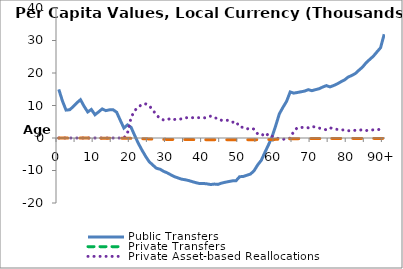
| Category | Public Transfers | Private Transfers | Private Asset-based Reallocations | Public Asset-based Reallocations |
|---|---|---|---|---|
| 0 | 14954.861 |  | 0 | -24.969 |
|  | 11405.367 |  | 0 | -25.362 |
| 2 | 8583.302 |  | 0 | -25.443 |
| 3 | 8690.376 |  | 0 | -25.832 |
| 4 | 9661.006 |  | 0 | -26.406 |
| 5 | 10826.258 |  | 0 | -27.664 |
| 6 | 11781.906 |  | 0 | -28.86 |
| 7 | 9738.86 |  | 0 | -30.226 |
| 8 | 8010.276 |  | 0 | -31.709 |
| 9 | 8787.24 |  | 0 | -33.604 |
| 10 | 7155.697 |  | 0 | -35.446 |
| 11 | 8024.036 |  | 0 | -37.334 |
| 12 | 8953.118 |  | 0 | -39.25 |
| 13 | 8420.198 |  | 0 | -40.947 |
| 14 | 8661.51 |  | 0 | -42.291 |
| 15 | 8702.839 |  | 0 | -46.646 |
| 16 | 7925.226 |  | 0 | -50.253 |
| 17 | 5461.139 |  | 0 | -70.498 |
| 18 | 3071.807 |  | -39.151 | -71.726 |
| 19 | 4038.386 |  | 1506.614 | -77.946 |
| 20 | 3259.935 |  | 6338.708 | -112.965 |
| 21 | 743.406 |  | 8490.593 | -159.968 |
| 22 | -1659.075 |  | 9436.618 | -190.392 |
| 23 | -3717.588 |  | 10405.279 | -215.69 |
| 24 | -5617.556 |  | 10495.422 | -246.878 |
| 25 | -7285.582 |  | 9955.572 | -284.961 |
| 26 | -8317.609 |  | 8565.191 | -324.046 |
| 27 | -9308.223 |  | 7126.051 | -358.262 |
| 28 | -9607.378 |  | 5956.751 | -387.359 |
| 29 | -10261.497 |  | 5533.091 | -413.277 |
| 30 | -10729.683 |  | 5657.179 | -429.216 |
| 31 | -11336.564 |  | 6039.987 | -443.482 |
| 32 | -11900.776 |  | 5711.046 | -449.962 |
| 33 | -12295.538 |  | 5773.24 | -460.736 |
| 34 | -12680.016 |  | 5890.182 | -467.344 |
| 35 | -12858.986 |  | 6272.66 | -476.956 |
| 36 | -13112.317 |  | 6174.3 | -484.683 |
| 37 | -13459.433 |  | 6245.967 | -495.726 |
| 38 | -13764.535 |  | 6269.608 | -503.348 |
| 39 | -14031.447 |  | 6260.303 | -509.782 |
| 40 | -13991.654 |  | 6170.234 | -515.309 |
| 41 | -14113.073 |  | 6310.04 | -521.289 |
| 42 | -14316.885 |  | 6738.254 | -528.334 |
| 43 | -14175.922 |  | 6133.765 | -533.127 |
| 44 | -14278.446 |  | 6112.396 | -534.244 |
| 45 | -13890.117 |  | 5440.755 | -536.208 |
| 46 | -13615.869 |  | 5497.928 | -539.399 |
| 47 | -13403.059 |  | 5404.872 | -536.955 |
| 48 | -13189.836 |  | 4842.527 | -539.392 |
| 49 | -13173.845 |  | 5061.652 | -538.012 |
| 50 | -11913.704 |  | 3411.382 | -531.349 |
| 51 | -11843.188 |  | 3267.269 | -526.795 |
| 52 | -11457.296 |  | 2772.275 | -521.801 |
| 53 | -11102.412 |  | 3082.765 | -521.454 |
| 54 | -10089.913 |  | 2729.662 | -507.889 |
| 55 | -8292.425 |  | 1265.849 | -505.554 |
| 56 | -6857.855 |  | 1347.94 | -495.432 |
| 57 | -4453.024 |  | 422.242 | -486.738 |
| 58 | -2088.785 |  | 1310.73 | -461.686 |
| 59 | 406.686 |  | 498.895 | -449.181 |
| 60 | 3813.275 |  | 10.49 | -420.693 |
| 61 | 7438.818 |  | -202.709 | -370.207 |
| 62 | 9440.926 |  | -434.705 | -342.109 |
| 63 | 11278.705 |  | -104.125 | -293.949 |
| 64 | 14168.341 |  | -59.778 | -261.488 |
| 65 | 13809.608 |  | 2067.711 | -222.015 |
| 66 | 14005.48 |  | 3184.492 | -198.76 |
| 67 | 14222.515 |  | 3231.876 | -189.254 |
| 68 | 14439.83 |  | 3314.882 | -181.865 |
| 69 | 14872.002 |  | 3130.366 | -176.11 |
| 70 | 14561.126 |  | 3550.368 | -172.251 |
| 71 | 14876.027 |  | 3348.253 | -167.911 |
| 72 | 15159.186 |  | 3066.435 | -165.196 |
| 73 | 15681.571 |  | 2797.296 | -157.956 |
| 74 | 16119.827 |  | 2519.416 | -150.229 |
| 75 | 15723.616 |  | 3129.9 | -145.223 |
| 76 | 16137.583 |  | 2845.985 | -141.224 |
| 77 | 16638.101 |  | 2638.907 | -137.236 |
| 78 | 17280.573 |  | 2464.328 | -134.329 |
| 79 | 17843.491 |  | 2494.278 | -132.864 |
| 80 | 18716.511 |  | 2221.14 | -131.396 |
| 81 | 19232.966 |  | 2299.323 | -127.155 |
| 82 | 19822.119 |  | 2362.527 | -125.204 |
| 83 | 20845.082 |  | 2373.472 | -125.155 |
| 84 | 21813.049 |  | 2545.018 | -125.114 |
| 85 | 23152.611 |  | 2303.487 | -126.055 |
| 86 | 24174.081 |  | 2399.725 | -124.496 |
| 87 | 25165.518 |  | 2510.97 | -123.467 |
| 88 | 26488.287 |  | 2583.715 | -124.808 |
| 89 | 27780.35 |  | 2647.819 | -123.454 |
| 90+ | 31932.129 |  | 2883.291 | -121.305 |